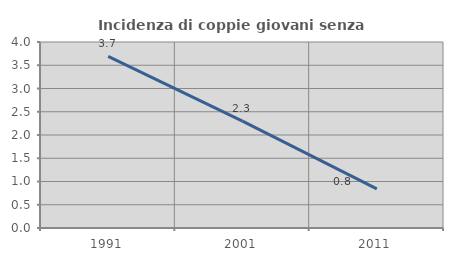
| Category | Incidenza di coppie giovani senza figli |
|---|---|
| 1991.0 | 3.691 |
| 2001.0 | 2.299 |
| 2011.0 | 0.84 |